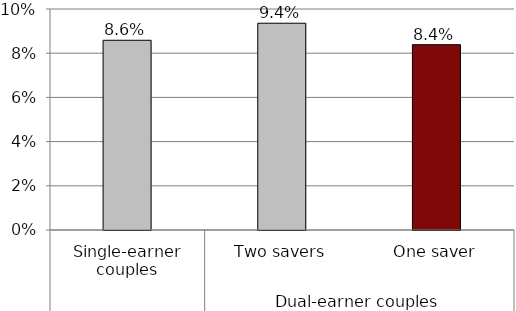
| Category | Series 0 |
|---|---|
| 0 | 0.086 |
| 1 | 0.094 |
| 2 | 0.084 |